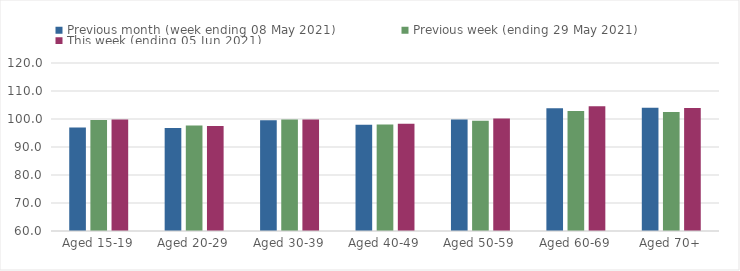
| Category | Previous month (week ending 08 May 2021) | Previous week (ending 29 May 2021) | This week (ending 05 Jun 2021) |
|---|---|---|---|
| Aged 15-19 | 96.98 | 99.65 | 99.83 |
| Aged 20-29 | 96.78 | 97.67 | 97.46 |
| Aged 30-39 | 99.55 | 99.82 | 99.86 |
| Aged 40-49 | 97.94 | 98.01 | 98.28 |
| Aged 50-59 | 99.84 | 99.36 | 100.15 |
| Aged 60-69 | 103.82 | 102.88 | 104.57 |
| Aged 70+ | 104.04 | 102.54 | 103.9 |